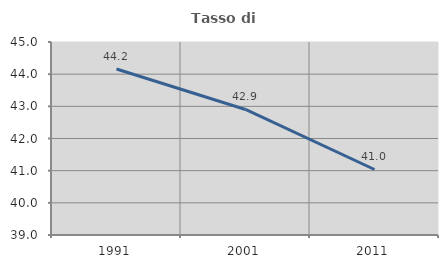
| Category | Tasso di occupazione   |
|---|---|
| 1991.0 | 44.16 |
| 2001.0 | 42.903 |
| 2011.0 | 41.037 |